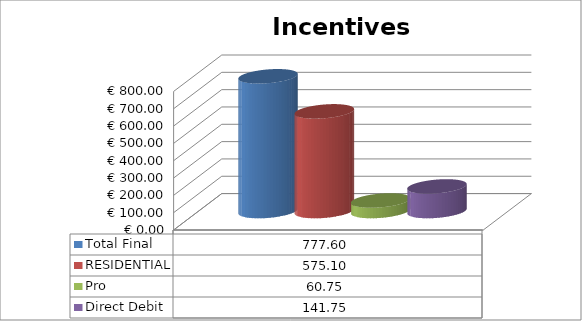
| Category | Total Final | RESIDENTIAL | Pro | Direct Debit |
|---|---|---|---|---|
|  | 777.6 | 575.1 | 60.75 | 141.75 |